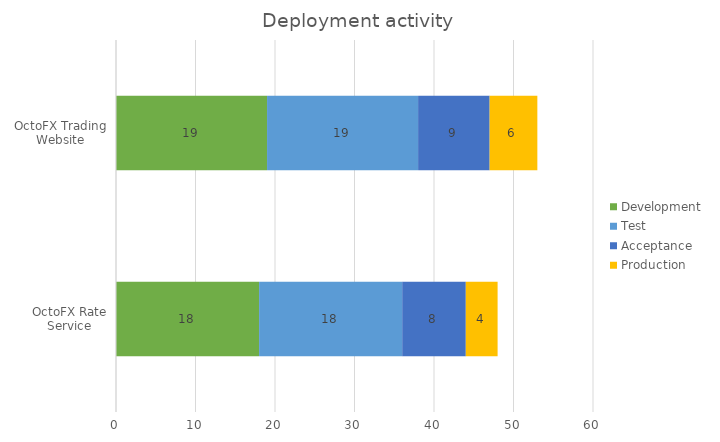
| Category | Development | Test | Acceptance | Production |
|---|---|---|---|---|
| OctoFX Rate Service | 18 | 18 | 8 | 4 |
| OctoFX Trading Website | 19 | 19 | 9 | 6 |